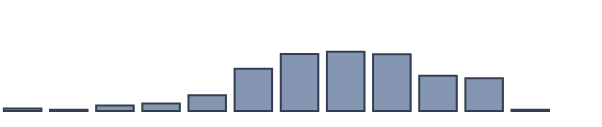
| Category | Series 0 |
|---|---|
| 0 | 0.8 |
| 1 | 0.4 |
| 2 | 1.7 |
| 3 | 2.4 |
| 4 | 5 |
| 5 | 13.3 |
| 6 | 18 |
| 7 | 18.7 |
| 8 | 17.9 |
| 9 | 11.1 |
| 10 | 10.3 |
| 11 | 0.4 |
| 12 | 0 |